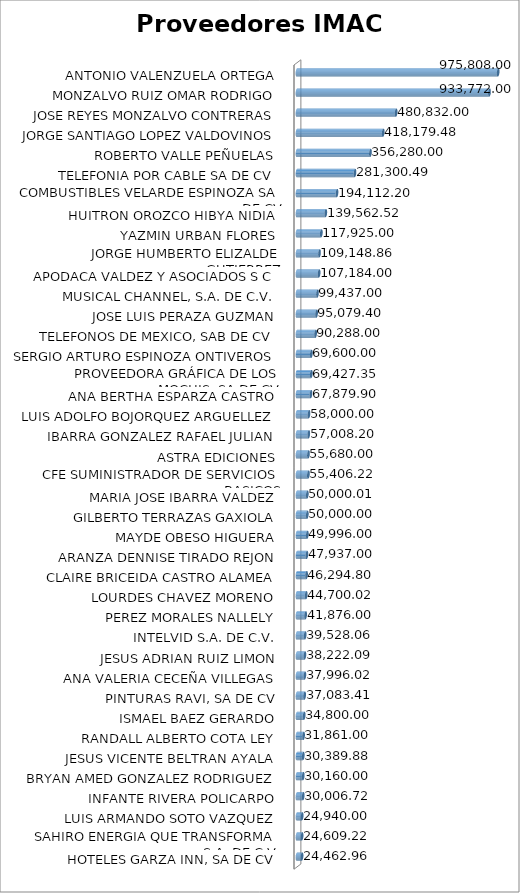
| Category | Suma |
|---|---|
| HOTELES GARZA INN, SA DE CV | 24462.96 |
| SAHIRO ENERGIA QUE TRANSFORMA  S.A. DE C.V. | 24609.22 |
| LUIS ARMANDO SOTO VAZQUEZ | 24940 |
| INFANTE RIVERA POLICARPO | 30006.72 |
| BRYAN AMED GONZALEZ RODRIGUEZ | 30160 |
| JESUS VICENTE BELTRAN AYALA | 30389.88 |
| RANDALL ALBERTO COTA LEY | 31861 |
| ISMAEL BAEZ GERARDO | 34800 |
| PINTURAS RAVI, SA DE CV | 37083.41 |
| ANA VALERIA CECEÑA VILLEGAS | 37996.02 |
| JESUS ADRIAN RUIZ LIMON | 38222.09 |
| INTELVID S.A. DE C.V. | 39528.06 |
| PEREZ MORALES NALLELY | 41876 |
| LOURDES CHAVEZ MORENO | 44700.02 |
| CLAIRE BRICEIDA CASTRO ALAMEA | 46294.8 |
| ARANZA DENNISE TIRADO REJON | 47937 |
| MAYDE OBESO HIGUERA | 49996 |
| GILBERTO TERRAZAS GAXIOLA | 50000 |
| MARIA JOSE IBARRA VALDEZ | 50000.01 |
| CFE SUMINISTRADOR DE SERVICIOS BASICOS | 55406.22 |
| ASTRA EDICIONES | 55680 |
| IBARRA GONZALEZ RAFAEL JULIAN | 57008.2 |
| LUIS ADOLFO BOJORQUEZ ARGUELLEZ | 58000 |
| ANA BERTHA ESPARZA CASTRO | 67879.9 |
| PROVEEDORA GRÁFICA DE LOS MOCHIS, SA DE CV | 69427.35 |
| SERGIO ARTURO ESPINOZA ONTIVEROS | 69600 |
| TELEFONOS DE MEXICO, SAB DE CV | 90288 |
| JOSE LUIS PERAZA GUZMAN | 95079.4 |
| MUSICAL CHANNEL, S.A. DE C.V. | 99437 |
| APODACA VALDEZ Y ASOCIADOS S C | 107184 |
| JORGE HUMBERTO ELIZALDE GUTIERREZ | 109148.86 |
| YAZMIN URBAN FLORES | 117925 |
| HUITRON OROZCO HIBYA NIDIA | 139562.52 |
| COMBUSTIBLES VELARDE ESPINOZA SA DE CV | 194112.2 |
| TELEFONIA POR CABLE SA DE CV | 281300.49 |
| ROBERTO VALLE PEÑUELAS | 356280 |
| JORGE SANTIAGO LOPEZ VALDOVINOS | 418179.48 |
| JOSE REYES MONZALVO CONTRERAS | 480832 |
| MONZALVO RUIZ OMAR RODRIGO | 933772 |
| ANTONIO VALENZUELA ORTEGA | 975808 |